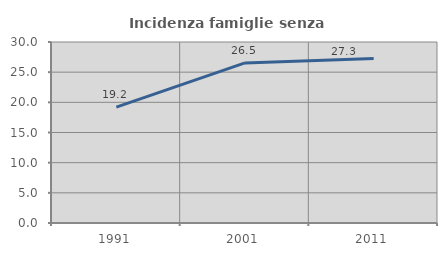
| Category | Incidenza famiglie senza nuclei |
|---|---|
| 1991.0 | 19.216 |
| 2001.0 | 26.539 |
| 2011.0 | 27.276 |